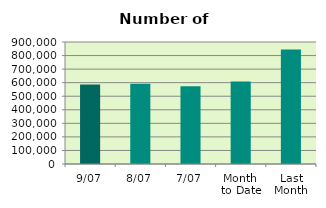
| Category | Series 0 |
|---|---|
| 9/07 | 585738 |
| 8/07 | 592174 |
| 7/07 | 574130 |
| Month 
to Date | 608045.429 |
| Last
Month | 844726.818 |